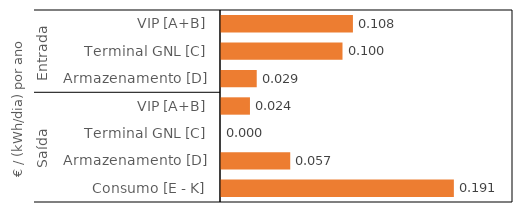
| Category | Series 0 |
|---|---|
| 0 | 0.108 |
| 1 | 0.1 |
| 2 | 0.029 |
| 3 | 0.024 |
| 4 | 0 |
| 5 | 0.057 |
| 6 | 0.191 |